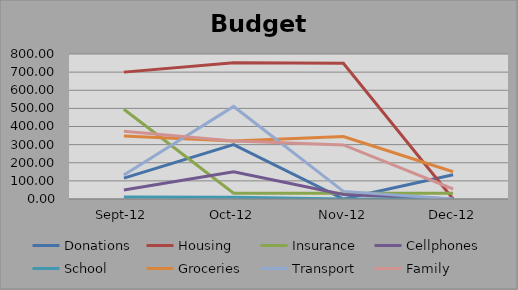
| Category | Donations | Housing | Insurance | Cellphones | School | Groceries | Transport | Family |
|---|---|---|---|---|---|---|---|---|
| 2012-09-01 | 115 | 700 | 495.49 | 50 | 10.56 | 348.24 | 132.61 | 373.66 |
| 2012-10-01 | 300 | 751.89 | 31.49 | 150 | 10 | 319.9 | 510.68 | 320.17 |
| 2012-11-01 | 0 | 748.68 | 31.45 | 25 | 0 | 344.67 | 41.94 | 298.28 |
| 2012-12-01 | 134 | 0 | 31.49 | 0 | 0 | 150.45 | 0 | 55.1 |